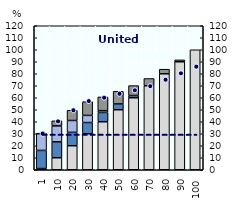
| Category | Gross earnings | Social assistance | Housing benefits | Family benefits | In-work benefits |
|---|---|---|---|---|---|
| 1.0 | 1 | 15.12 | 0 | 13.908 | 0.423 |
| 10.0 | 10 | 13.279 | 0 | 13.252 | 4.24 |
| 20.0 | 20 | 11.183 | 0 | 9.884 | 8.48 |
| 30.0 | 30.001 | 9.365 | 0 | 5.939 | 11.417 |
| 40.0 | 40.001 | 7.758 | 0 | 1.51 | 11.417 |
| 50.0 | 50.001 | 4.846 | 0 | 0 | 10.497 |
| 60.0 | 59.999 | 1.864 | 0 | 0 | 8.265 |
| 70.0 | 69.999 | 0 | 0 | 0 | 6.032 |
| 80.0 | 80 | 0 | 0 | 0 | 3.799 |
| 90.0 | 90 | 0 | 0 | 0 | 1.567 |
| 100.0 | 100 | 0 | 0 | 0 | 0 |